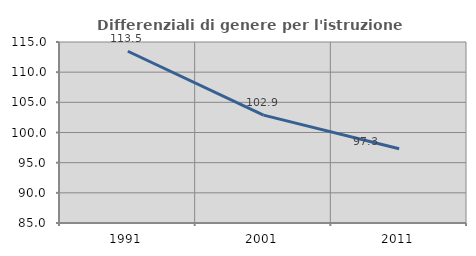
| Category | Differenziali di genere per l'istruzione superiore |
|---|---|
| 1991.0 | 113.466 |
| 2001.0 | 102.884 |
| 2011.0 | 97.317 |